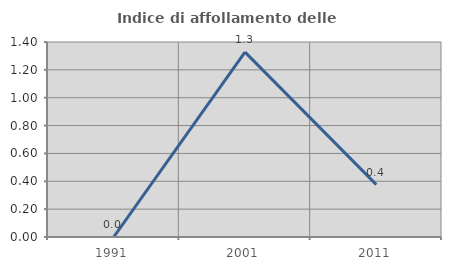
| Category | Indice di affollamento delle abitazioni  |
|---|---|
| 1991.0 | 0 |
| 2001.0 | 1.327 |
| 2011.0 | 0.376 |